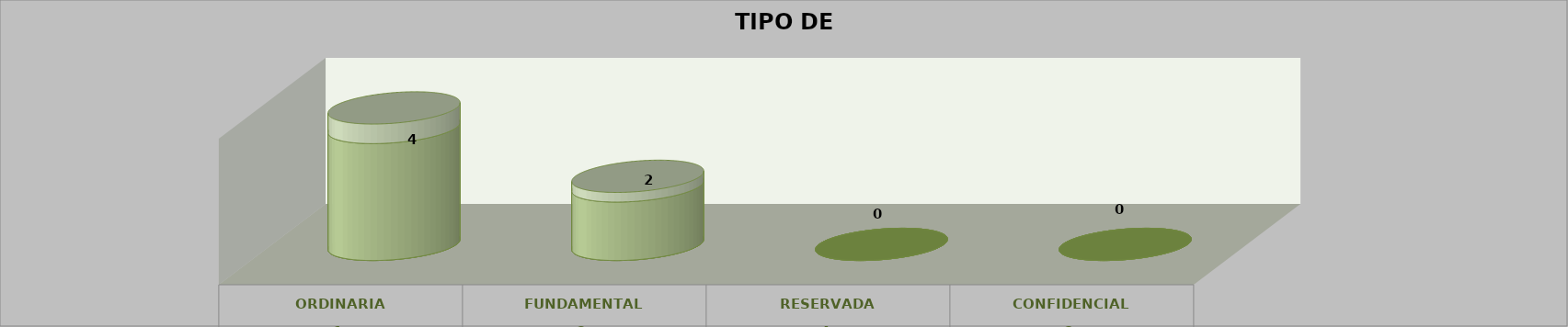
| Category | Series 0 | Series 2 | Series 1 | Series 3 | Series 4 |
|---|---|---|---|---|---|
| 0 |  |  |  | 4 | 0.67 |
| 1 |  |  |  | 2 | 0.33 |
| 2 |  |  |  | 0 | 0 |
| 3 |  |  |  | 0 | 0 |